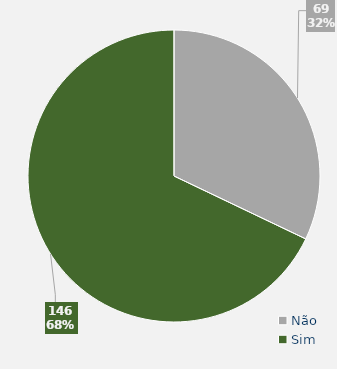
| Category | Total |
|---|---|
| Não | 69 |
| Sim | 146 |